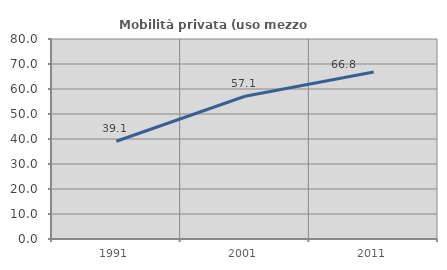
| Category | Mobilità privata (uso mezzo privato) |
|---|---|
| 1991.0 | 39.094 |
| 2001.0 | 57.093 |
| 2011.0 | 66.822 |